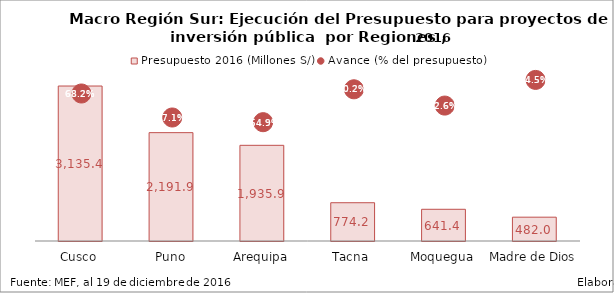
| Category | Presupuesto 2016 (Millones S/) |
|---|---|
| Cusco | 3135.418 |
| Puno | 2191.93 |
| Arequipa | 1935.859 |
| Tacna | 774.222 |
| Moquegua | 641.397 |
| Madre de Dios | 481.951 |